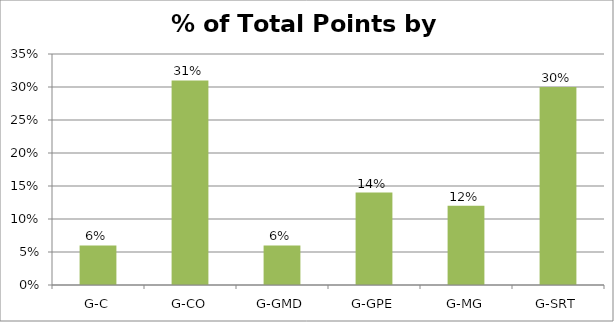
| Category | % of Total Points |
|---|---|
| G-C | 0.06 |
| G-CO | 0.31 |
| G-GMD | 0.06 |
| G-GPE | 0.14 |
| G-MG | 0.12 |
| G-SRT | 0.3 |